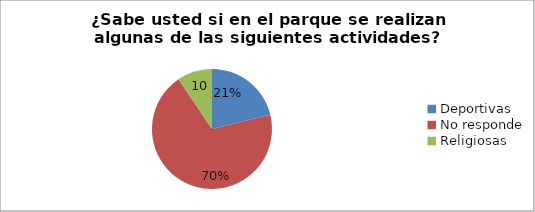
| Category | Series 0 |
|---|---|
| Deportivas | 0.212 |
| No responde | 0.694 |
| Religiosas | 0.094 |